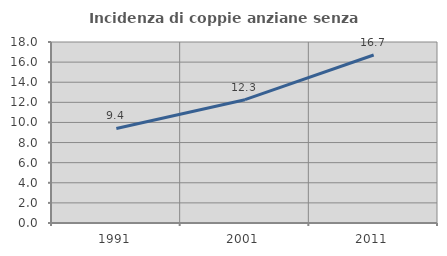
| Category | Incidenza di coppie anziane senza figli  |
|---|---|
| 1991.0 | 9.405 |
| 2001.0 | 12.265 |
| 2011.0 | 16.707 |